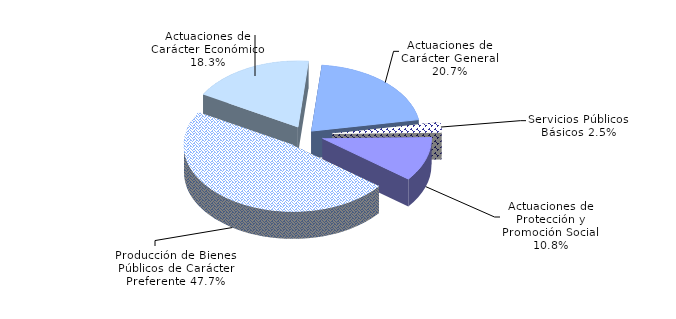
| Category | Series 0 |
|---|---|
| Servicios Públicos Básicos | 2.485 |
| Actuaciones de Protección y Promoción Social | 10.849 |
| Producción de Bienes Públicos de Carácter Preferente | 47.664 |
| Actuaciones de Carácter Económico | 18.318 |
| Actuaciones de Carácter General | 20.684 |